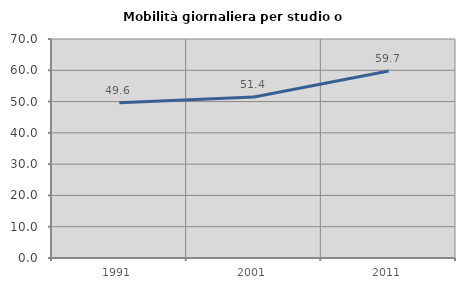
| Category | Mobilità giornaliera per studio o lavoro |
|---|---|
| 1991.0 | 49.642 |
| 2001.0 | 51.449 |
| 2011.0 | 59.742 |